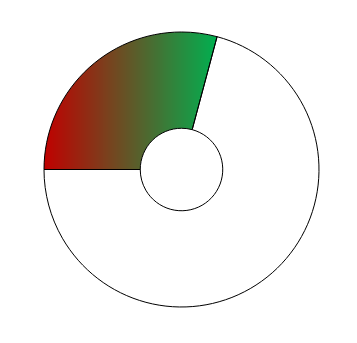
| Category | Series 0 |
|---|---|
| 0 | 105 |
| 1 | 255 |